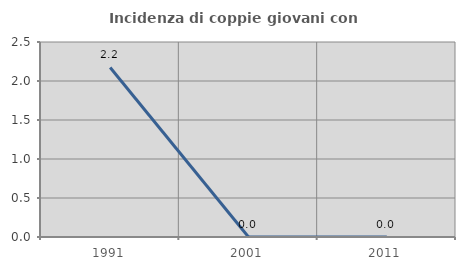
| Category | Incidenza di coppie giovani con figli |
|---|---|
| 1991.0 | 2.174 |
| 2001.0 | 0 |
| 2011.0 | 0 |